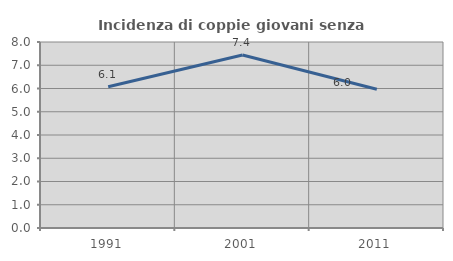
| Category | Incidenza di coppie giovani senza figli |
|---|---|
| 1991.0 | 6.076 |
| 2001.0 | 7.442 |
| 2011.0 | 5.97 |